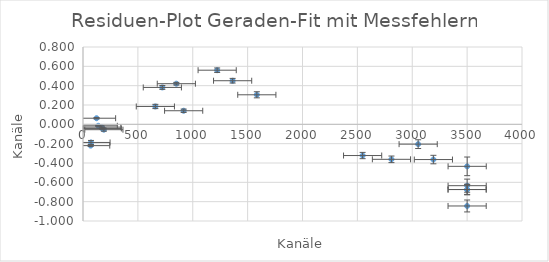
| Category | Series 0 |
|---|---|
| 72.808 | -0.188 |
| 1583.9 | 0.306 |
| 3500.2 | -0.675 |
| 2810.57 | -0.362 |
| 3192.68 | -0.364 |
| 3500.2 | -0.675 |
| 138.817 | -0.015 |
| 1222.58 | 0.56 |
| 3053.92 | -0.205 |
| 3500.24 | -0.635 |
| 170.618 | -0.029 |
| 175.811 | -0.042 |
| 1363.31 | 0.451 |
| 2547.79 | -0.323 |
| 3500.03 | -0.845 |
| 69.896 | -0.22 |
| 123.492 | 0.063 |
| 190.266 | -0.055 |
| 659.322 | 0.185 |
| 722.99 | 0.382 |
| 850.561 | 0.42 |
| 917.092 | 0.141 |
| 3500.44 | -0.435 |